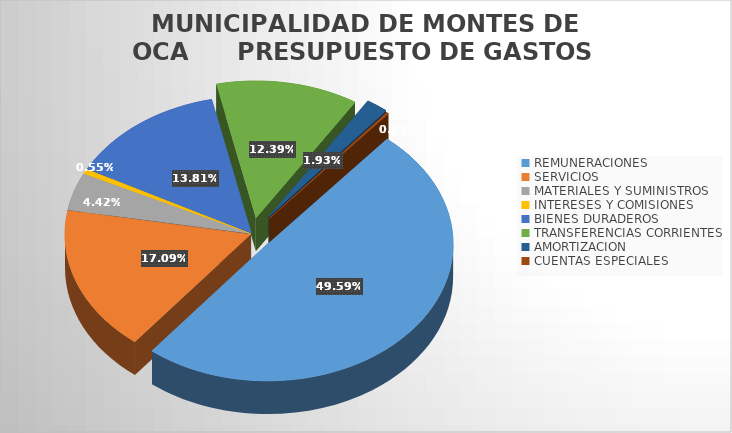
| Category | Series 0 |
|---|---|
| REMUNERACIONES | 2774387906.94 |
| SERVICIOS  | 956366093.7 |
| MATERIALES Y SUMINISTROS | 247274108.46 |
| INTERESES Y COMISIONES  | 30891957.51 |
| BIENES DURADEROS | 772713846.01 |
| TRANSFERENCIAS CORRIENTES | 693037041.62 |
| AMORTIZACION  | 108041228.54 |
| CUENTAS ESPECIALES | 11730628.49 |